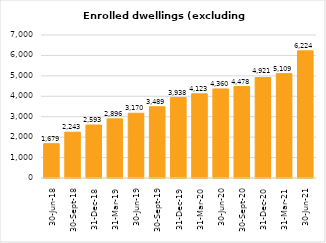
| Category | Enrolled dwellings (excluding in-kind) |
|---|---|
| 2018-06-30 | 1679 |
| 2018-09-30 | 2243 |
| 2018-12-31 | 2593 |
| 2019-03-31 | 2896 |
| 2019-06-30 | 3170 |
| 2019-09-30 | 3489 |
| 2019-12-31 | 3938 |
| 2020-03-31 | 4123 |
| 2020-06-30 | 4360 |
| 2020-09-30 | 4478 |
| 2020-12-31 | 4921 |
| 2021-03-31 | 5109 |
| 2021-06-30 | 6224 |